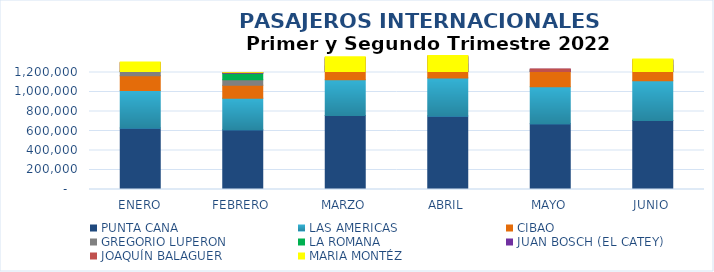
| Category | PUNTA CANA | LAS AMERICAS | CIBAO | GREGORIO LUPERON | LA ROMANA | JUAN BOSCH (EL CATEY) | JOAQUÍN BALAGUER | MARIA MONTÉZ |
|---|---|---|---|---|---|---|---|---|
| ENERO | 631955 | 384460 | 151453 | 58369 | 80531 | 5728 | 6563 | 10 |
| FEBRERO | 612546 | 323088 | 134017 | 55751 | 66122 | 5481 | 6492 | 9 |
| MARZO | 759074 | 365311 | 151563 | 71331 | 11102 | 6294 | 6899 | 1 |
| ABRIL | 754200 | 388126 | 154765 | 63533 | 13591 | 4597 | 6735 | 6 |
| MAYO | 675210 | 379686 | 156296 | 25283 | 6417 | 2411 | 7926 | 0 |
| JUNIO | 708528 | 406505 | 169097 | 47417 | 5946 | 3480 | 7048 | 1 |